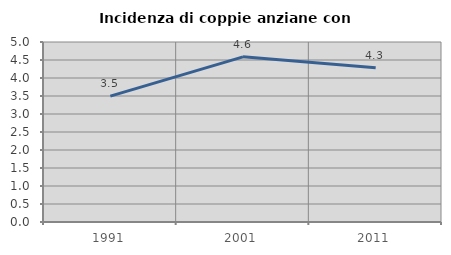
| Category | Incidenza di coppie anziane con figli |
|---|---|
| 1991.0 | 3.495 |
| 2001.0 | 4.588 |
| 2011.0 | 4.286 |